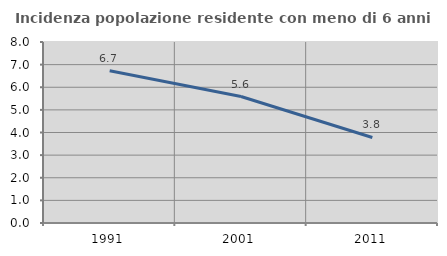
| Category | Incidenza popolazione residente con meno di 6 anni |
|---|---|
| 1991.0 | 6.726 |
| 2001.0 | 5.59 |
| 2011.0 | 3.78 |